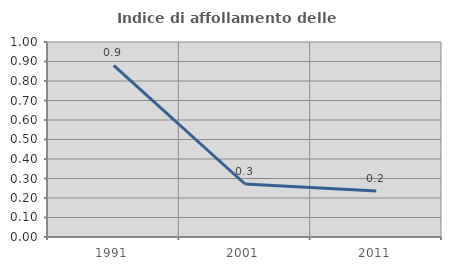
| Category | Indice di affollamento delle abitazioni  |
|---|---|
| 1991.0 | 0.88 |
| 2001.0 | 0.272 |
| 2011.0 | 0.236 |